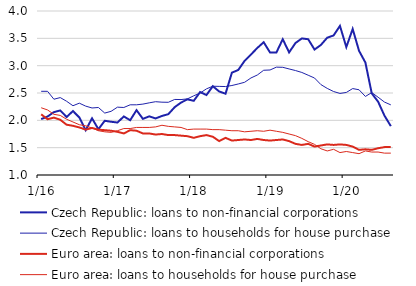
| Category | Czech Republic: loans to non-financial corporations | Czech Republic: loans to households for house purchase | Euro area: loans to non-financial corporations | Euro area: loans to households for house purchase |
|---|---|---|---|---|
|  1/16 | 2.022 | 2.531 | 2.11 | 2.23 |
| 2 | 2.069 | 2.531 | 2.02 | 2.19 |
| 3 | 2.15 | 2.386 | 2.05 | 2.11 |
| 4 | 2.181 | 2.416 | 2.01 | 2.09 |
| 5 | 2.061 | 2.349 | 1.92 | 2.02 |
| 6 | 2.17 | 2.267 | 1.9 | 1.97 |
| 7 | 2.053 | 2.314 | 1.87 | 1.92 |
| 8 | 1.819 | 2.26 | 1.83 | 1.9 |
| 9 | 2.037 | 2.226 | 1.86 | 1.86 |
| 10 | 1.837 | 2.235 | 1.83 | 1.81 |
| 11 | 1.992 | 2.133 | 1.82 | 1.79 |
| 12 | 1.974 | 2.165 | 1.81 | 1.78 |
|  1/17 | 1.96 | 2.241 | 1.79 | 1.81 |
| 2 | 2.071 | 2.235 | 1.76 | 1.85 |
| 3 | 2.002 | 2.284 | 1.82 | 1.85 |
| 4 | 2.186 | 2.284 | 1.81 | 1.87 |
| 5 | 2.027 | 2.297 | 1.76 | 1.87 |
| 6 | 2.073 | 2.32 | 1.76 | 1.87 |
| 7 | 2.035 | 2.341 | 1.74 | 1.88 |
| 8 | 2.08 | 2.332 | 1.75 | 1.91 |
| 9 | 2.113 | 2.33 | 1.73 | 1.89 |
| 10 | 2.241 | 2.382 | 1.73 | 1.88 |
| 11 | 2.325 | 2.38 | 1.72 | 1.87 |
| 12 | 2.384 | 2.392 | 1.71 | 1.83 |
|  1/18 | 2.357 | 2.449 | 1.68 | 1.84 |
| 2 | 2.517 | 2.499 | 1.71 | 1.84 |
| 3 | 2.463 | 2.576 | 1.73 | 1.84 |
| 4 | 2.624 | 2.624 | 1.7 | 1.83 |
| 5 | 2.528 | 2.621 | 1.62 | 1.83 |
| 6 | 2.487 | 2.618 | 1.68 | 1.82 |
| 7 | 2.872 | 2.637 | 1.63 | 1.81 |
| 8 | 2.921 | 2.665 | 1.64 | 1.81 |
| 9 | 3.088 | 2.696 | 1.65 | 1.79 |
| 10 | 3.204 | 2.775 | 1.64 | 1.8 |
| 11 | 3.324 | 2.829 | 1.66 | 1.81 |
| 12 | 3.429 | 2.916 | 1.64 | 1.8 |
|  1/19 | 3.241 | 2.921 | 1.63 | 1.82 |
| 2 | 3.241 | 2.973 | 1.64 | 1.8 |
| 3 | 3.484 | 2.97 | 1.65 | 1.78 |
| 4 | 3.243 | 2.94 | 1.62 | 1.75 |
| 5 | 3.414 | 2.911 | 1.57 | 1.72 |
| 6 | 3.498 | 2.876 | 1.55 | 1.67 |
| 7 | 3.484 | 2.825 | 1.57 | 1.61 |
| 8 | 3.295 | 2.774 | 1.52 | 1.56 |
| 9 | 3.379 | 2.654 | 1.54 | 1.48 |
| 10 | 3.512 | 2.584 | 1.56 | 1.44 |
| 11 | 3.553 | 2.527 | 1.55 | 1.47 |
| 12 | 3.727 | 2.492 | 1.56 | 1.41 |
|  1/20 | 3.34 | 2.51 | 1.55 | 1.43 |
| 2 | 3.671 | 2.581 | 1.52 | 1.41 |
| 3 | 3.272 | 2.559 | 1.46 | 1.39 |
| 4 | 3.057 | 2.437 | 1.47 | 1.44 |
| 5 | 2.493 | 2.508 | 1.46 | 1.42 |
| 6 | 2.341 | 2.423 | 1.49 | 1.42 |
| 7 | 2.086 | 2.334 | 1.51 | 1.4 |
| 8 | 1.894 | 2.283 | 1.51 | 1.4 |